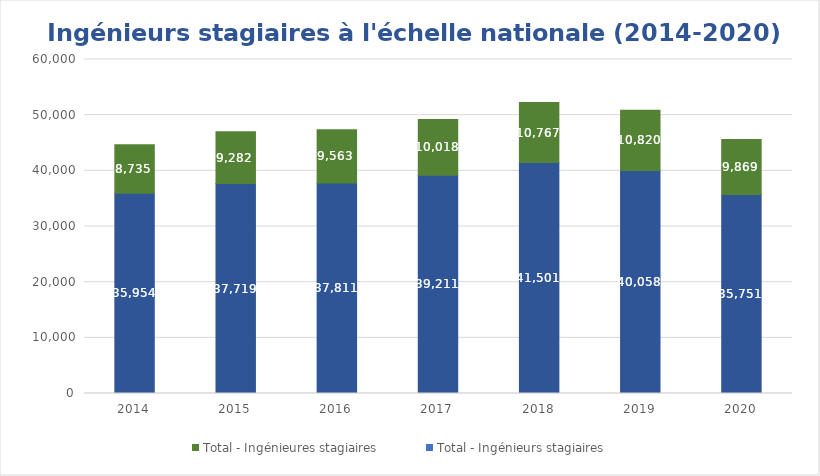
| Category | Total - Ingénieurs stagiaires  | Total - Ingénieures stagiaires |
|---|---|---|
| 2014.0 | 35954 | 8735 |
| 2015.0 | 37719 | 9282 |
| 2016.0 | 37811 | 9563 |
| 2017.0 | 39211 | 10018 |
| 2018.0 | 41501 | 10767 |
| 2019.0 | 40058 | 10820 |
| 2020.0 | 35751 | 9869 |